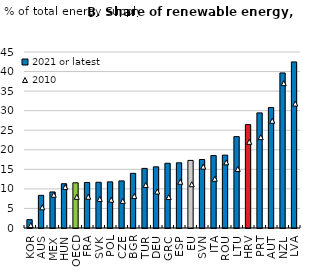
| Category | 2021 or latest |
|---|---|
| KOR | 2.13 |
| AUS | 8.35 |
| MEX | 9.22 |
| HUN | 11.32 |
| OECD | 11.56 |
| FRA | 11.64 |
| SVK | 11.69 |
| POL | 11.8 |
| CZE | 12.04 |
| BGR | 13.97 |
| TUR | 15.24 |
| DEU | 15.64 |
| GRC | 16.55 |
| ESP | 16.67 |
| EU | 17.28 |
| SVN | 17.51 |
| ITA | 18.52 |
| ROU | 18.63 |
| LTU | 23.37 |
| HRV | 26.44 |
| PRT | 29.43 |
| AUT | 30.8 |
| NZL | 39.65 |
| LVA | 42.46 |